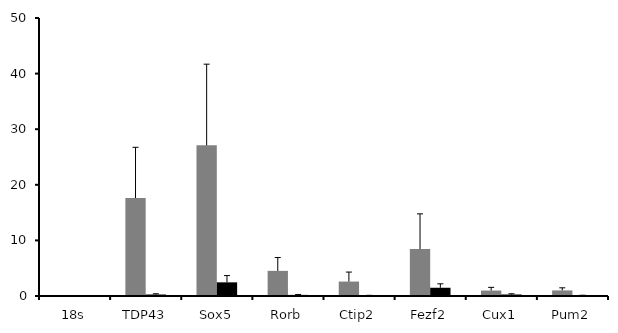
| Category | UV | Non UV |
|---|---|---|
| 18s | 0.035 | 0.024 |
| TDP43 | 17.613 | 0.269 |
| Sox5 | 27.094 | 2.455 |
| Rorb | 4.521 | 0.2 |
| Ctip2 | 2.599 | 0.084 |
| Fezf2 | 8.439 | 1.484 |
| Cux1 | 0.978 | 0.272 |
| Pum2 | 1.007 | 0.094 |